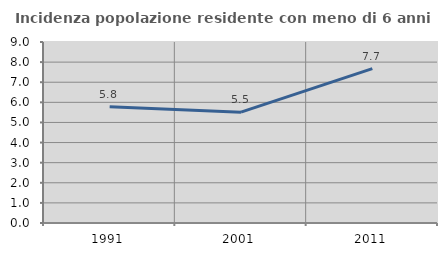
| Category | Incidenza popolazione residente con meno di 6 anni |
|---|---|
| 1991.0 | 5.782 |
| 2001.0 | 5.513 |
| 2011.0 | 7.675 |